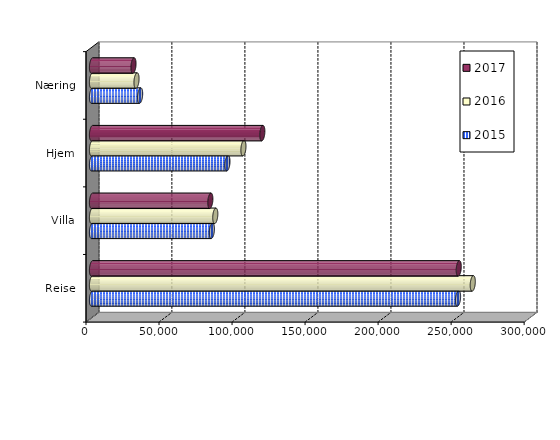
| Category | 2015 | 2016 | 2017 |
|---|---|---|---|
| Reise | 250627 | 260701 | 251107 |
| Villa | 82065.255 | 84406.459 | 81028.962 |
| Hjem | 92730.628 | 103685.176 | 116619.831 |
| Næring | 32945.626 | 30478.767 | 28413.151 |